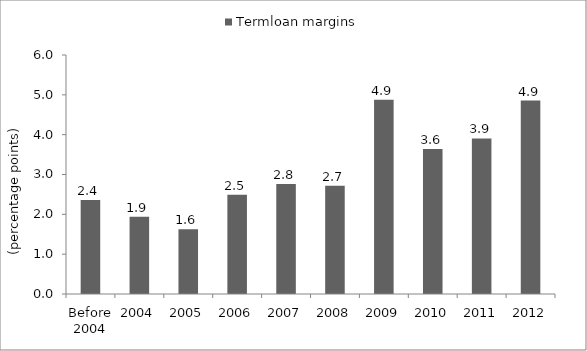
| Category | Termloan margins |
|---|---|
| Before 2004 | 2.357 |
| 2004 | 1.94 |
| 2005 | 1.627 |
| 2006 | 2.49 |
| 2007 | 2.761 |
| 2008 | 2.719 |
| 2009 | 4.876 |
| 2010 | 3.639 |
| 2011 | 3.904 |
| 2012 | 4.857 |